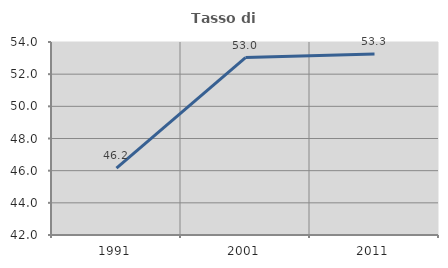
| Category | Tasso di occupazione   |
|---|---|
| 1991.0 | 46.154 |
| 2001.0 | 53.035 |
| 2011.0 | 53.259 |